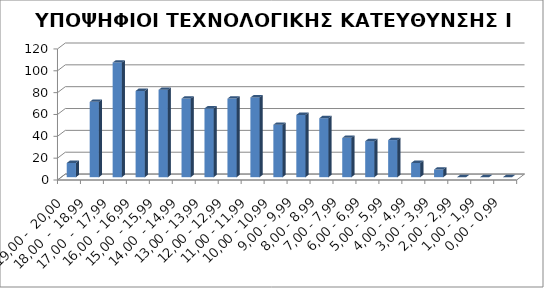
| Category | ΥΠΟΨΗΦΙΟΙ |
|---|---|
| 19,00 -  20,00 | 13 |
| 18,00  -  18,99 | 69 |
| 17,00  -  17,99 | 105 |
| 16,00  - 16,99 | 79 |
| 15,00  - 15,99 | 80 |
| 14,00  - 14,99 | 72 |
| 13,00 - 13,99 | 63 |
| 12,00 - 12,99 | 72 |
| 11,00 - 11,99 | 73 |
| 10,00 - 10,99 | 48 |
| 9,00 - 9,99 | 57 |
| 8,00 - 8,99 | 54 |
| 7,00 - 7,99 | 36 |
| 6,00 - 6,99 | 33 |
| 5,00 - 5,99 | 34 |
| 4,00 - 4,99 | 13 |
| 3,00 - 3,99 | 7 |
| 2,00 - 2,99 | 0 |
| 1,00 - 1,99 | 0 |
| 0,00 - 0,99 | 0 |